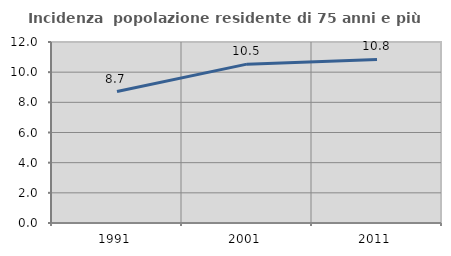
| Category | Incidenza  popolazione residente di 75 anni e più |
|---|---|
| 1991.0 | 8.717 |
| 2001.0 | 10.532 |
| 2011.0 | 10.84 |